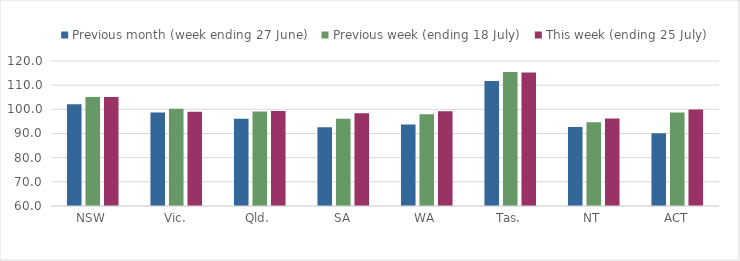
| Category | Previous month (week ending 27 June) | Previous week (ending 18 July) | This week (ending 25 July) |
|---|---|---|---|
| NSW | 102.131 | 105.14 | 105.075 |
| Vic. | 98.739 | 100.199 | 99.022 |
| Qld. | 96.087 | 99.098 | 99.292 |
| SA | 92.609 | 96.101 | 98.402 |
| WA | 93.729 | 98.015 | 99.185 |
| Tas. | 111.751 | 115.449 | 115.275 |
| NT | 92.736 | 94.693 | 96.188 |
| ACT | 90.066 | 98.675 | 99.974 |